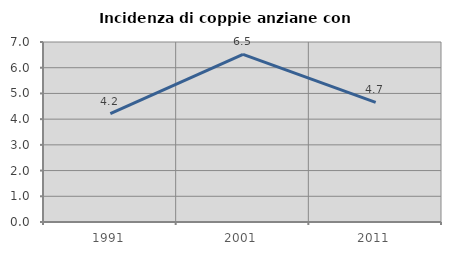
| Category | Incidenza di coppie anziane con figli |
|---|---|
| 1991.0 | 4.211 |
| 2001.0 | 6.522 |
| 2011.0 | 4.651 |